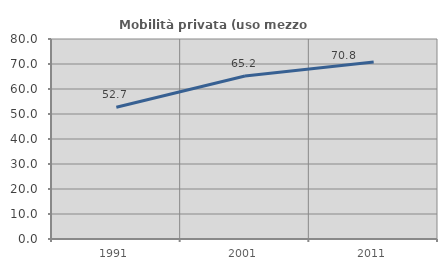
| Category | Mobilità privata (uso mezzo privato) |
|---|---|
| 1991.0 | 52.69 |
| 2001.0 | 65.226 |
| 2011.0 | 70.775 |